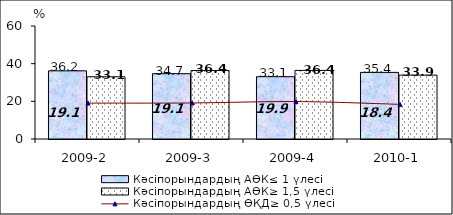
| Category | Кәсіпорындардың АӨК≤ 1 үлесі | Кәсіпорындардың АӨК≥ 1,5 үлесі |
|---|---|---|
| 2009-2 | 36.196 | 33.05 |
| 2009-3 | 34.694 | 36.355 |
| 2009-4 | 33.091 | 36.421 |
| 2010-1 | 35.369 | 33.913 |